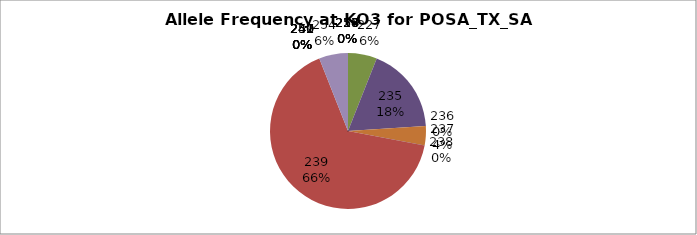
| Category | Series 0 |
|---|---|
| 218.0 | 0 |
| 224.0 | 0 |
| 227.0 | 0.06 |
| 235.0 | 0.18 |
| 236.0 | 0 |
| 237.0 | 0.04 |
| 238.0 | 0 |
| 239.0 | 0.66 |
| 240.0 | 0 |
| 241.0 | 0 |
| 247.0 | 0 |
| 249.0 | 0 |
| 250.0 | 0 |
| 251.0 | 0 |
| 252.0 | 0 |
| 254.0 | 0.06 |
| 255.0 | 0 |
| 256.0 | 0 |
| 257.0 | 0 |